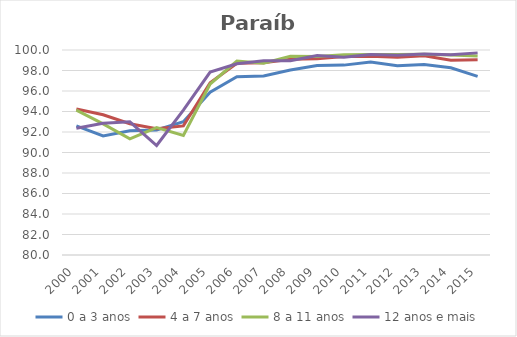
| Category | 0 a 3 anos | 4 a 7 anos | 8 a 11 anos | 12 anos e mais |
|---|---|---|---|---|
| 2000.0 | 92.596 | 94.245 | 94.141 | 92.366 |
| 2001.0 | 91.621 | 93.685 | 92.789 | 92.847 |
| 2002.0 | 92.129 | 92.813 | 91.324 | 92.997 |
| 2003.0 | 92.198 | 92.329 | 92.437 | 90.682 |
| 2004.0 | 93 | 92.598 | 91.668 | 94.139 |
| 2005.0 | 95.884 | 96.797 | 96.683 | 97.847 |
| 2006.0 | 97.401 | 98.699 | 98.924 | 98.661 |
| 2007.0 | 97.472 | 98.748 | 98.717 | 98.944 |
| 2008.0 | 98.053 | 99.092 | 99.387 | 98.942 |
| 2009.0 | 98.493 | 99.149 | 99.372 | 99.455 |
| 2010.0 | 98.525 | 99.37 | 99.544 | 99.284 |
| 2011.0 | 98.817 | 99.402 | 99.573 | 99.552 |
| 2012.0 | 98.471 | 99.284 | 99.568 | 99.495 |
| 2013.0 | 98.577 | 99.44 | 99.587 | 99.603 |
| 2014.0 | 98.267 | 99.003 | 99.502 | 99.543 |
| 2015.0 | 97.426 | 99.04 | 99.425 | 99.72 |